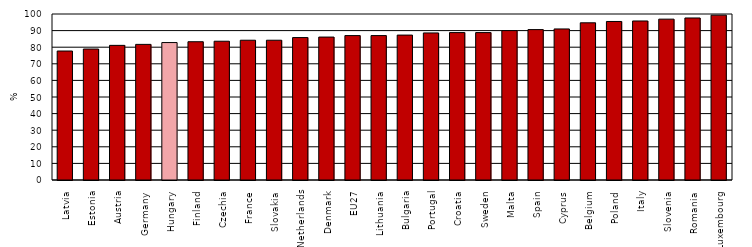
| Category | Series 0 |
|---|---|
| Latvia | 77.7 |
| Estonia | 78.9 |
| Austria | 81.1 |
| Germany | 81.7 |
| Hungary | 82.8 |
| Finland | 83.3 |
| Czechia | 83.6 |
| France | 84.2 |
| Slovakia | 84.2 |
| Netherlands | 85.8 |
| Denmark | 86.1 |
| EU27 | 87 |
| Lithuania | 87 |
| Bulgaria | 87.3 |
| Portugal | 88.6 |
| Croatia | 88.8 |
| Sweden | 88.8 |
| Malta | 90 |
| Spain | 90.6 |
| Cyprus | 91 |
| Belgium | 94.7 |
| Poland | 95.5 |
| Italy | 95.8 |
| Slovenia | 96.9 |
| Romania | 97.6 |
| Luxembourg | 99.3 |